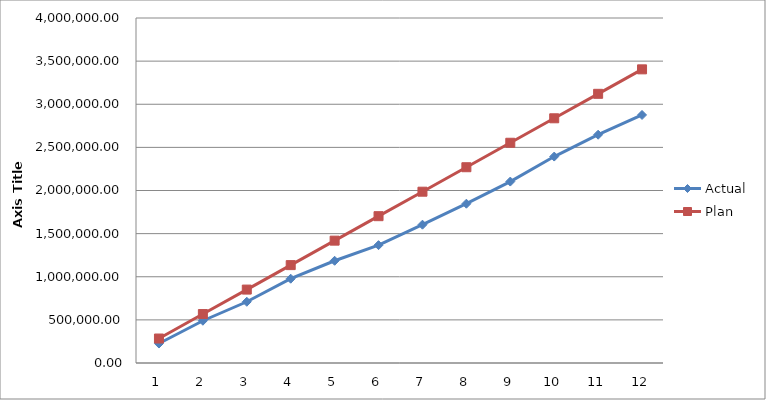
| Category | Actual | Plan |
|---|---|---|
| 0 | 225671.01 | 283725 |
| 1 | 489878.87 | 567450 |
| 2 | 709927.22 | 851175 |
| 3 | 977256.42 | 1134900 |
| 4 | 1185274.71 | 1418625 |
| 5 | 1366428.37 | 1702350 |
| 6 | 1603445.01 | 1986075 |
| 7 | 1846851.47 | 2269800 |
| 8 | 2103537.24 | 2553525 |
| 9 | 2393438.58 | 2837250 |
| 10 | 2646885.15 | 3120975 |
| 11 | 2875896.36 | 3404700 |